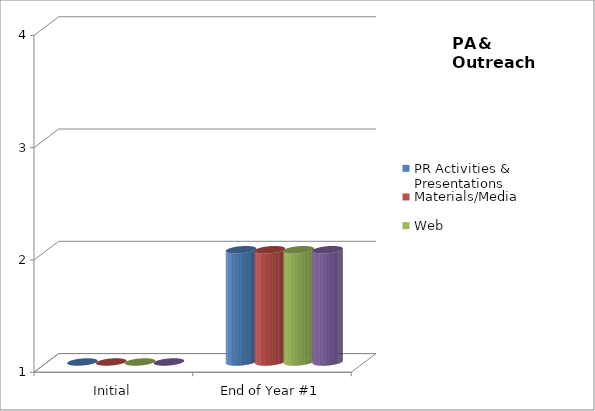
| Category | PR Activities & Presentations  | Materials/Media  | Web | Accessibility/Diversity  |
|---|---|---|---|---|
| Initial | 1 | 1 | 1 | 1 |
| End of Year #1 | 2 | 2 | 2 | 2 |